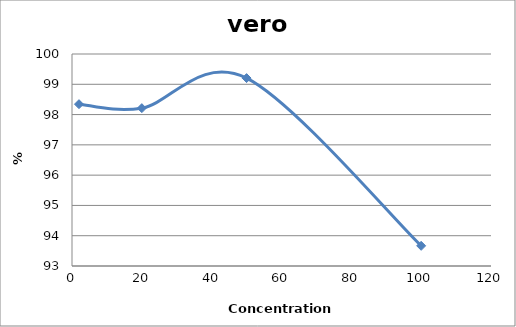
| Category | vero chu2 |
|---|---|
| 100.0 | 93.666 |
| 50.0 | 99.204 |
| 20.0 | 98.212 |
| 2.0 | 98.343 |
| nan | 0 |
| nan | 0 |
| nan | 0 |
| nan | 0 |
| nan | 0 |